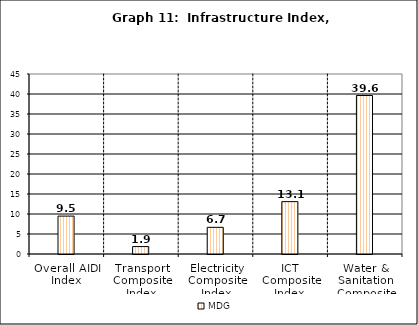
| Category | Series 0 | MDG | Series 2 |
|---|---|---|---|
| Overall AIDI Index |  | 9.475 |  |
| Transport Composite Index |  | 1.859 |  |
| Electricity Composite Index |  | 6.667 |  |
| ICT Composite Index  |  | 13.092 |  |
| Water & Sanitation Composite Index |  | 39.617 |  |